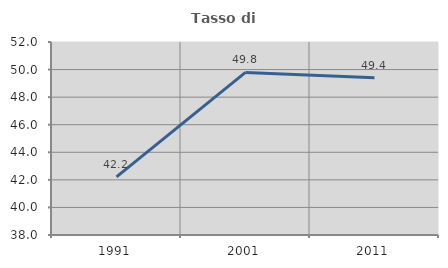
| Category | Tasso di occupazione   |
|---|---|
| 1991.0 | 42.211 |
| 2001.0 | 49.793 |
| 2011.0 | 49.409 |